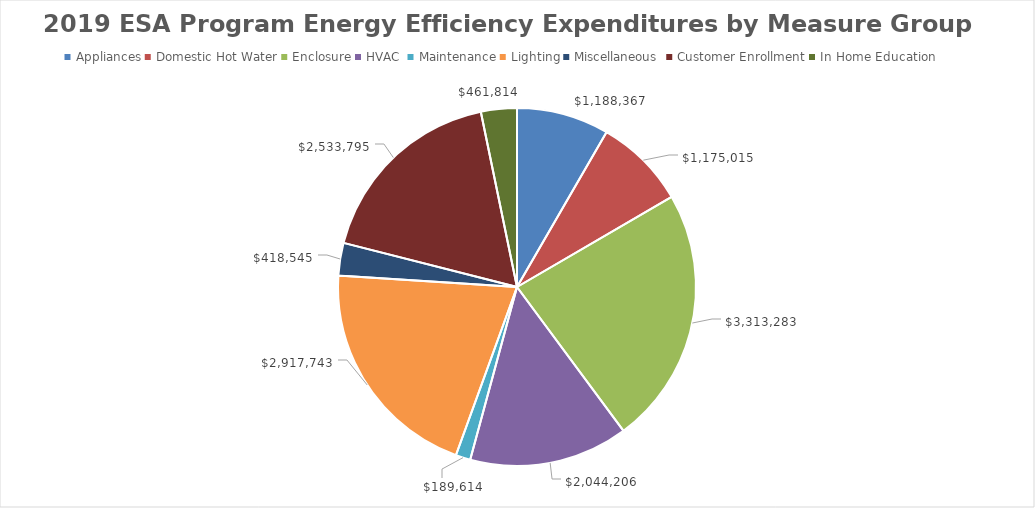
| Category | Series 0 |
|---|---|
| Appliances | 1188366.52 |
| Domestic Hot Water | 1175015.18 |
| Enclosure | 3313283.49 |
| HVAC  | 2044206.2 |
| Maintenance | 189613.57 |
| Lighting | 2917742.63 |
| Miscellaneous  | 418544.65 |
| Customer Enrollment | 2533795.46 |
| In Home Education | 461813.58 |